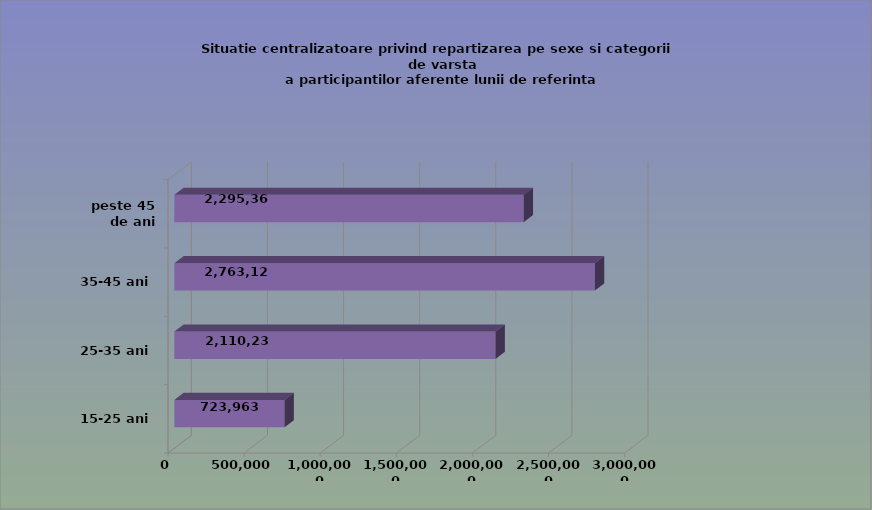
| Category | 15-25 ani 25-35 ani 35-45 ani peste 45 de ani |
|---|---|
| 15-25 ani | 723963 |
| 25-35 ani | 2110235 |
| 35-45 ani | 2763125 |
| peste 45 de ani | 2295361 |